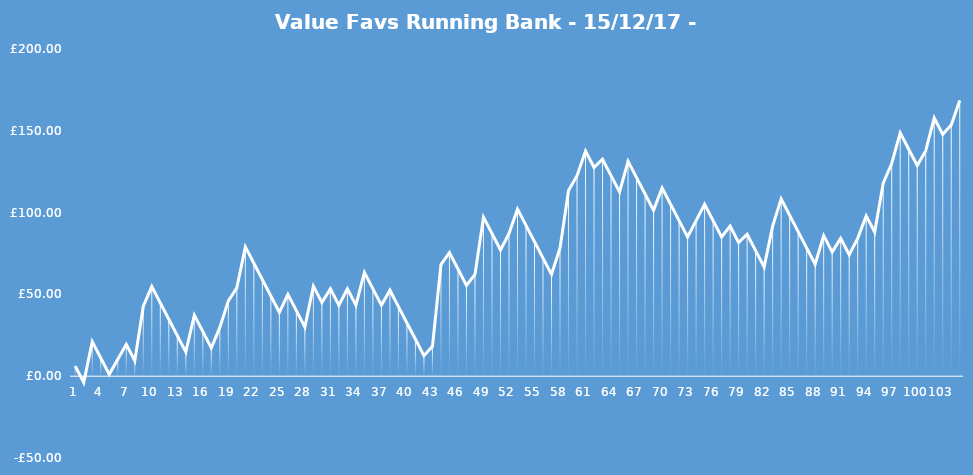
| Category | Series 0 |
|---|---|
| 0 | 6.15 |
| 1 | -3.85 |
| 2 | 21.15 |
| 3 | 11.15 |
| 4 | 1.15 |
| 5 | 10.3 |
| 6 | 19.45 |
| 7 | 9.45 |
| 8 | 42.8 |
| 9 | 54.8 |
| 10 | 44.8 |
| 11 | 34.8 |
| 12 | 24.8 |
| 13 | 14.8 |
| 14 | 37.3 |
| 15 | 27.3 |
| 16 | 17.3 |
| 17 | 29.8 |
| 18 | 46.05 |
| 19 | 54.05 |
| 20 | 79.05 |
| 21 | 69.05 |
| 22 | 59.05 |
| 23 | 49.05 |
| 24 | 39.05 |
| 25 | 50.05 |
| 26 | 40.05 |
| 27 | 30.05 |
| 28 | 55.05 |
| 29 | 45.05 |
| 30 | 53.4 |
| 31 | 43.4 |
| 32 | 53.4 |
| 33 | 43.4 |
| 34 | 63.4 |
| 35 | 53.4 |
| 36 | 43.4 |
| 37 | 52.55 |
| 38 | 42.55 |
| 39 | 32.55 |
| 40 | 22.55 |
| 41 | 12.55 |
| 42 | 18.25 |
| 43 | 68.25 |
| 44 | 75.5 |
| 45 | 65.5 |
| 46 | 55.5 |
| 47 | 62.2 |
| 48 | 97.2 |
| 49 | 87.2 |
| 50 | 77.2 |
| 51 | 87.2 |
| 52 | 102.2 |
| 53 | 92.2 |
| 54 | 82.2 |
| 55 | 72.2 |
| 56 | 62.2 |
| 57 | 78.45 |
| 58 | 113.45 |
| 59 | 122.6 |
| 60 | 137.6 |
| 61 | 127.6 |
| 62 | 132.6 |
| 63 | 122.6 |
| 64 | 112.6 |
| 65 | 131.35 |
| 66 | 121.35 |
| 67 | 111.35 |
| 68 | 101.35 |
| 69 | 115.1 |
| 70 | 105.1 |
| 71 | 95.1 |
| 72 | 85.1 |
| 73 | 95.1 |
| 74 | 105.1 |
| 75 | 95.1 |
| 76 | 85.1 |
| 77 | 91.75 |
| 78 | 81.75 |
| 79 | 86.75 |
| 80 | 76.75 |
| 81 | 66.75 |
| 82 | 91.75 |
| 83 | 108.4 |
| 84 | 98.4 |
| 85 | 88.4 |
| 86 | 78.4 |
| 87 | 68.4 |
| 88 | 85.9 |
| 89 | 75.9 |
| 90 | 84.25 |
| 91 | 74.25 |
| 92 | 84.25 |
| 93 | 98 |
| 94 | 88 |
| 95 | 118 |
| 96 | 130 |
| 97 | 148.75 |
| 98 | 138.75 |
| 99 | 128.75 |
| 100 | 137.85 |
| 101 | 157.85 |
| 102 | 147.85 |
| 103 | 153.55 |
| 104 | 168.55 |